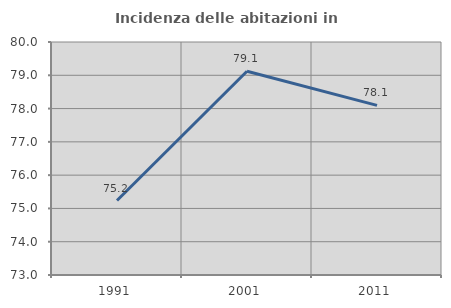
| Category | Incidenza delle abitazioni in proprietà  |
|---|---|
| 1991.0 | 75.237 |
| 2001.0 | 79.122 |
| 2011.0 | 78.096 |